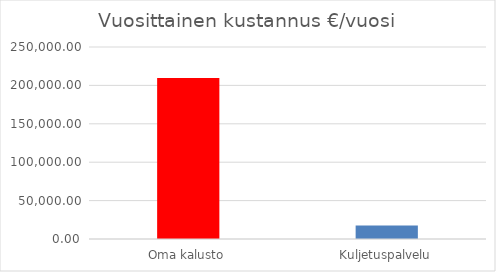
| Category | Vuosittainen kustannus |
|---|---|
| Oma kalusto | 209752.619 |
| Kuljetuspalvelu | 17625 |